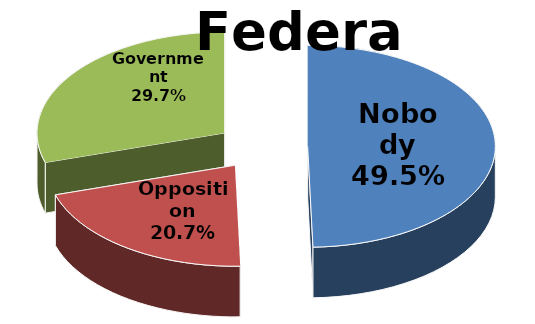
| Category | Federal |
|---|---|
| Nobody | 0.495 |
| Opposition | 0.207 |
| Government | 0.297 |